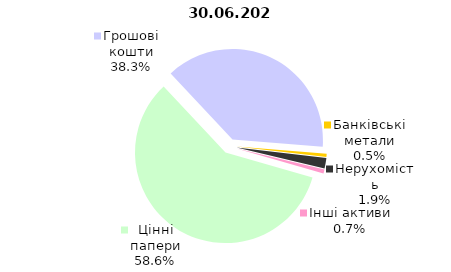
| Category | Всього |
|---|---|
| Цінні папери | 1058.161 |
| Грошові кошти | 691.315 |
| Банківські метали | 9.733 |
| Нерухомість | 34.26 |
| Інші активи | 12.848 |